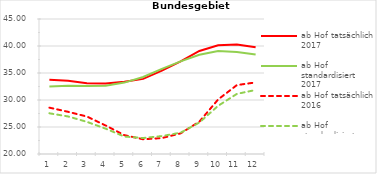
| Category | ab Hof tatsächlich 2017 | ab Hof standardisiert 2017 | ab Hof tatsächlich 2016 | ab Hof standardisiert 2016 |
|---|---|---|---|---|
| 0 | 33.736 | 32.485 | 28.583 | 27.54 |
| 1 | 33.573 | 32.649 | 27.813 | 26.952 |
| 2 | 33.123 | 32.597 | 26.941 | 25.955 |
| 3 | 33.072 | 32.632 | 25.28 | 24.693 |
| 4 | 33.372 | 33.222 | 23.492 | 23.234 |
| 5 | 33.911 | 34.267 | 22.727 | 22.958 |
| 6 | 35.443 | 35.775 | 22.949 | 23.316 |
| 7 | 37.138 | 37.146 | 23.822 | 23.951 |
| 8 | 39.074 | 38.376 | 25.995 | 25.828 |
| 9 | 40.126 | 39.071 | 30.098 | 28.921 |
| 10 | 40.294 | 38.906 | 32.76 | 31.13 |
| 11 | 39.759 | 38.416 | 33.256 | 31.858 |